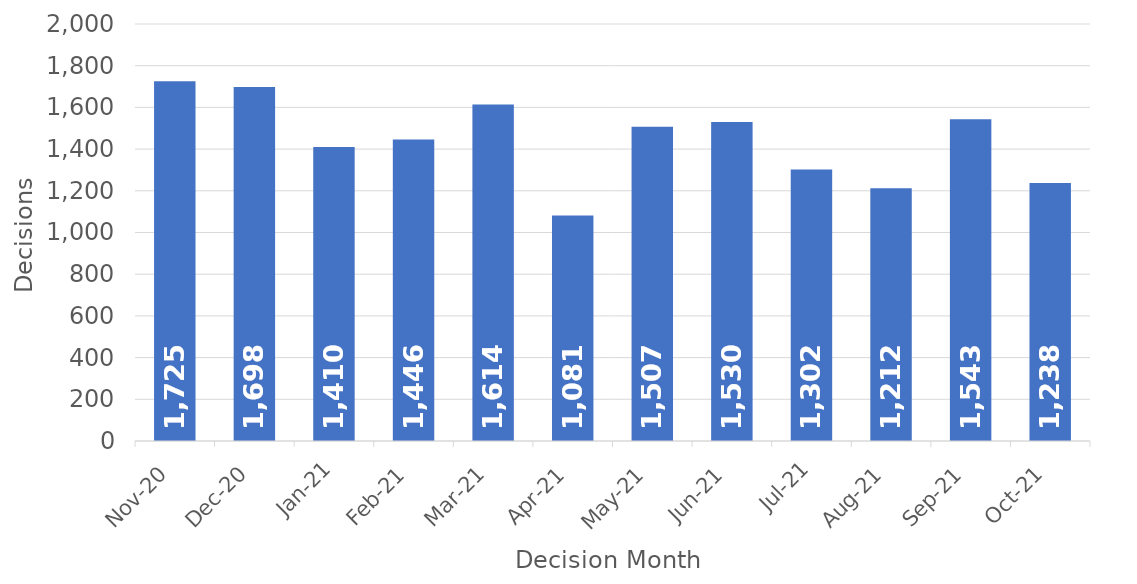
| Category | Decisions |
|---|---|
| Nov-20 | 1725 |
| Dec-20 | 1698 |
| Jan-21 | 1410 |
| Feb-21 | 1446 |
| Mar-21 | 1614 |
| Apr-21 | 1081 |
| May-21 | 1507 |
| Jun-21 | 1530 |
| Jul-21 | 1302 |
| Aug-21 | 1212 |
| Sep-21 | 1543 |
| Oct-21 | 1238 |